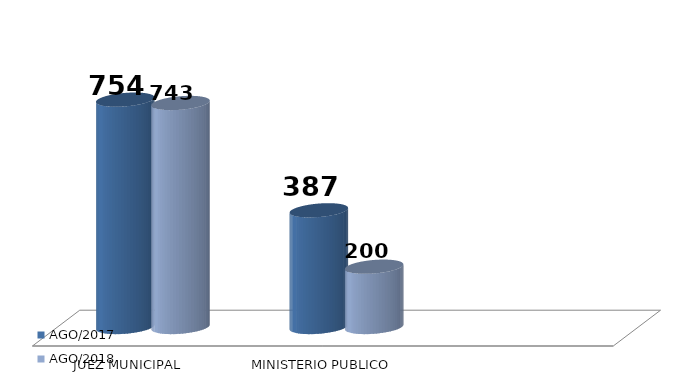
| Category | AGO/2017 | AGO/2018 |
|---|---|---|
| JUEZ MUNICIPAL | 754 | 743 |
| MINISTERIO PUBLICO | 387 | 200 |